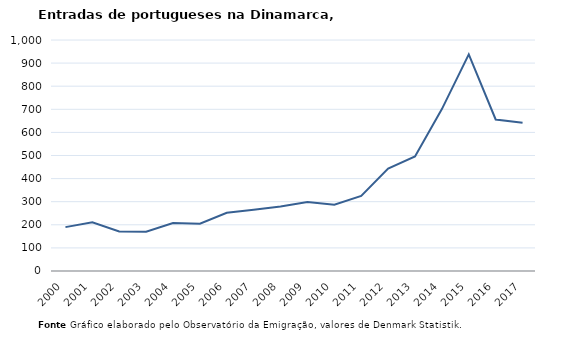
| Category | Entradas |
|---|---|
| 2000.0 | 190 |
| 2001.0 | 211 |
| 2002.0 | 171 |
| 2003.0 | 170 |
| 2004.0 | 208 |
| 2005.0 | 205 |
| 2006.0 | 252 |
| 2007.0 | 265 |
| 2008.0 | 279 |
| 2009.0 | 299 |
| 2010.0 | 287 |
| 2011.0 | 325 |
| 2012.0 | 443 |
| 2013.0 | 496 |
| 2014.0 | 701 |
| 2015.0 | 938 |
| 2016.0 | 656 |
| 2017.0 | 642 |